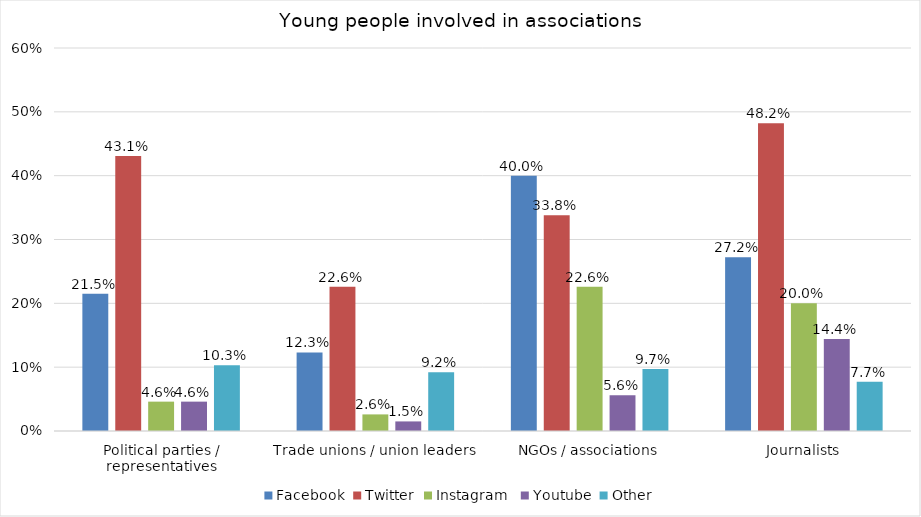
| Category | Facebook | Twitter | Instagram  | Youtube | Other |
|---|---|---|---|---|---|
| Political parties / representatives | 0.215 | 0.431 | 0.046 | 0.046 | 0.103 |
| Trade unions / union leaders | 0.123 | 0.226 | 0.026 | 0.015 | 0.092 |
| NGOs / associations | 0.4 | 0.338 | 0.226 | 0.056 | 0.097 |
| Journalists | 0.272 | 0.482 | 0.2 | 0.144 | 0.077 |